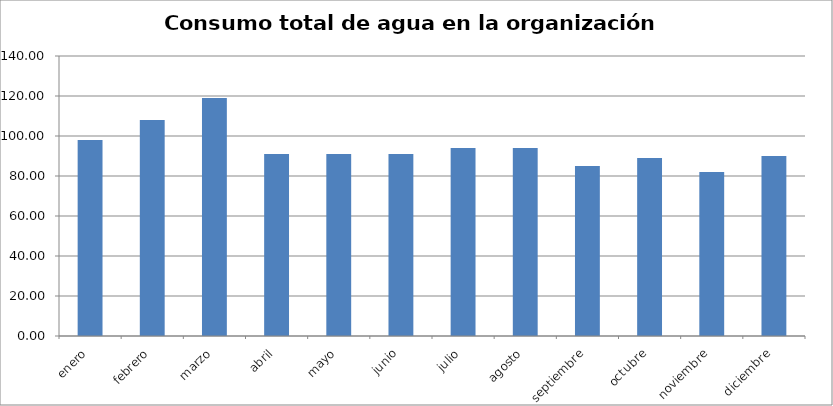
| Category | Series 0 |
|---|---|
| enero | 98 |
| febrero | 108 |
| marzo | 119 |
| abril | 91 |
| mayo | 91 |
| junio | 91 |
| julio | 94 |
| agosto | 94 |
| septiembre | 85 |
| octubre | 89 |
| noviembre | 82 |
| diciembre | 90 |